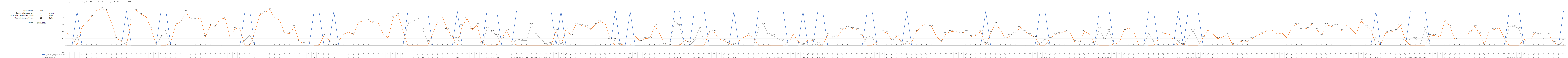
| Category | 1 = Strom reicht im Tagesdurchschnitt aus | Zusätzlich benötigter Strom | Überschüssiger Strom |
|---|---|---|---|
| 0 | 0 | 0.36 | 0 |
| 1 | 0 | 0.23 | 0 |
| 2 | 1 | 0 | 0.25 |
| 3 | 0 | 0.54 | 0 |
| 4 | 0 | 0.66 | 0 |
| 5 | 0 | 0.85 | 0 |
| 6 | 0 | 1.02 | 0 |
| 7 | 0 | 1.07 | 0 |
| 8 | 0 | 1.01 | 0 |
| 9 | 0 | 0.65 | 0 |
| 10 | 0 | 0.21 | 0 |
| 11 | 0 | 0.12 | 0 |
| 12 | 1 | 0 | 0.09 |
| 13 | 0 | 0.73 | 0 |
| 14 | 0 | 1.02 | 0 |
| 15 | 0 | 0.9 | 0 |
| 16 | 0 | 0.83 | 0 |
| 17 | 0 | 0.49 | 0 |
| 18 | 0 | 0.02 | 0 |
| 19 | 1 | 0 | 0.25 |
| 20 | 1 | 0 | 0.4 |
| 21 | 0 | 0.1 | 0 |
| 22 | 0 | 0.61 | 0 |
| 23 | 0 | 0.69 | 0 |
| 24 | 0 | 0.98 | 0 |
| 25 | 0 | 0.76 | 0 |
| 26 | 0 | 0.76 | 0 |
| 27 | 0 | 0.8 | 0 |
| 28 | 0 | 0.25 | 0 |
| 29 | 0 | 0.58 | 0 |
| 30 | 0 | 0.55 | 0 |
| 31 | 0 | 0.77 | 0 |
| 32 | 0 | 0.79 | 0 |
| 33 | 0 | 0.23 | 0 |
| 34 | 0 | 0.5 | 0 |
| 35 | 0 | 0.47 | 0 |
| 36 | 1 | 0 | 0.16 |
| 37 | 1 | 0 | 0.3 |
| 38 | 0 | 0.39 | 0 |
| 39 | 0 | 0.89 | 0 |
| 40 | 0 | 0.95 | 0 |
| 41 | 0 | 1.05 | 0 |
| 42 | 0 | 0.8 | 0 |
| 43 | 0 | 0.74 | 0 |
| 44 | 0 | 0.37 | 0 |
| 45 | 0 | 0.34 | 0 |
| 46 | 0 | 0.54 | 0 |
| 47 | 0 | 0.11 | 0 |
| 48 | 0 | 0.06 | 0 |
| 49 | 0 | 0.13 | 0 |
| 50 | 1 | 0 | 0.14 |
| 51 | 1 | 0 | 0.01 |
| 52 | 0 | 0.29 | 0 |
| 53 | 0 | 0.16 | 0 |
| 54 | 1 | 0 | 0 |
| 55 | 0 | 0.14 | 0 |
| 56 | 0 | 0.32 | 0 |
| 57 | 0 | 0.39 | 0 |
| 58 | 0 | 0.32 | 0 |
| 59 | 0 | 0.68 | 0 |
| 60 | 0 | 0.71 | 0 |
| 61 | 0 | 0.72 | 0 |
| 62 | 0 | 0.66 | 0 |
| 63 | 0 | 0.65 | 0 |
| 64 | 0 | 0.33 | 0 |
| 65 | 0 | 0.22 | 0 |
| 66 | 0 | 0.8 | 0 |
| 67 | 0 | 0.9 | 0 |
| 68 | 0 | 0.43 | 0 |
| 69 | 1 | 0 | 0.63 |
| 70 | 1 | 0 | 0.71 |
| 71 | 1 | 0 | 0.75 |
| 72 | 1 | 0 | 0.46 |
| 73 | 1 | 0 | 0.11 |
| 74 | 0 | 0.335 | 0 |
| 75 | 0 | 0.683 | 0 |
| 76 | 0 | 0.822 | 0 |
| 77 | 0 | 0.459 | 0 |
| 78 | 0 | 0.265 | 0 |
| 79 | 1 | 0 | 0.195 |
| 80 | 0 | 0.568 | 0 |
| 81 | 0 | 0.78 | 0 |
| 82 | 0 | 0.454 | 0 |
| 83 | 0 | 0.6 | 0 |
| 84 | 0 | 0.055 | 0 |
| 85 | 1 | 0 | 0.484 |
| 86 | 1 | 0 | 0.402 |
| 87 | 1 | 0 | 0.297 |
| 88 | 0 | 0.206 | 0 |
| 89 | 0 | 0.437 | 0 |
| 90 | 0 | 0.115 | 0 |
| 91 | 1 | 0 | 0.189 |
| 92 | 1 | 0 | 0.142 |
| 93 | 1 | 0 | 0.144 |
| 94 | 1 | 0 | 0.606 |
| 95 | 1 | 0 | 0.315 |
| 96 | 1 | 0 | 0.189 |
| 97 | 1 | 0 | 0.021 |
| 98 | 1 | 0 | 0.059 |
| 99 | 0 | 0.428 | 0 |
| 100 | 1 | 0 | 0.063 |
| 101 | 0 | 0.473 | 0 |
| 102 | 0 | 0.298 | 0 |
| 103 | 0 | 0.597 | 0 |
| 104 | 0 | 0.587 | 0 |
| 105 | 0 | 0.546 | 0 |
| 106 | 0 | 0.465 | 0 |
| 107 | 0 | 0.616 | 0 |
| 108 | 0 | 0.701 | 0 |
| 109 | 0 | 0.61 | 0 |
| 110 | 0 | 0.166 | 0 |
| 111 | 1 | 0 | 0.17 |
| 112 | 0 | 0.034 | 0 |
| 113 | 0 | 0.014 | 0 |
| 114 | 1 | 0 | 0.016 |
| 115 | 0 | 0.277 | 0 |
| 116 | 0 | 0.123 | 0 |
| 117 | 0 | 0.2 | 0 |
| 118 | 0 | 0.21 | 0 |
| 119 | 0 | 0.573 | 0 |
| 120 | 0 | 0.335 | 0 |
| 121 | 0 | 0.028 | 0 |
| 122 | 0 | 0.003 | 0 |
| 123 | 1 | 0 | 0.71 |
| 124 | 1 | 0 | 0.582 |
| 125 | 0 | 0.155 | 0 |
| 126 | 0 | 0.092 | 0 |
| 127 | 1 | 0 | 0.142 |
| 128 | 1 | 0 | 0.5 |
| 129 | 1 | 0 | 0.131 |
| 130 | 0 | 0.379 | 0 |
| 131 | 0 | 0.395 | 0 |
| 132 | 0 | 0.188 | 0 |
| 133 | 0 | 0.143 | 0 |
| 134 | 0 | 0.064 | 0 |
| 135 | 1 | 0 | 0.021 |
| 136 | 0 | 0.129 | 0 |
| 137 | 0 | 0.236 | 0 |
| 138 | 0 | 0.309 | 0 |
| 139 | 0 | 0.217 | 0 |
| 140 | 1 | 0 | 0.482 |
| 141 | 1 | 0 | 0.617 |
| 142 | 1 | 0 | 0.307 |
| 143 | 1 | 0 | 0.283 |
| 144 | 1 | 0 | 0.189 |
| 145 | 1 | 0 | 0.138 |
| 146 | 0 | 0.052 | 0 |
| 147 | 0 | 0.329 | 0 |
| 148 | 0 | 0.128 | 0 |
| 149 | 1 | 0 | 0.035 |
| 150 | 0 | 0.156 | 0 |
| 151 | 0 | 0.146 | 0 |
| 152 | 1 | 0 | 0.05 |
| 153 | 1 | 0 | 0.014 |
| 154 | 0 | 0.307 | 0 |
| 155 | 0 | 0.234 | 0 |
| 156 | 0 | 0.255 | 0 |
| 157 | 0 | 0.469 | 0 |
| 158 | 0 | 0.512 | 0 |
| 159 | 0 | 0.495 | 0 |
| 160 | 0 | 0.461 | 0 |
| 161 | 0 | 0.3 | 0 |
| 162 | 1 | 0 | 0.274 |
| 163 | 1 | 0 | 0.243 |
| 164 | 0 | 0.101 | 0 |
| 165 | 0 | 0.393 | 0 |
| 166 | 0 | 0.369 | 0 |
| 167 | 0 | 0.144 | 0 |
| 168 | 0 | 0.27 | 0 |
| 169 | 0 | 0.095 | 0 |
| 170 | 1 | 0 | 0.077 |
| 171 | 0 | 0.095 | 0 |
| 172 | 0 | 0.406 | 0 |
| 173 | 0 | 0.563 | 0 |
| 174 | 0 | 0.63 | 0 |
| 175 | 0 | 0.556 | 0 |
| 176 | 0 | 0.273 | 0 |
| 177 | 0 | 0.11 | 0 |
| 178 | 0 | 0.355 | 0 |
| 179 | 0 | 0.403 | 0 |
| 180 | 0 | 0.415 | 0 |
| 181 | 0 | 0.351 | 0 |
| 182 | 0 | 0.399 | 0 |
| 183 | 0 | 0.258 | 0 |
| 184 | 0 | 0.293 | 0 |
| 185 | 0 | 0.408 | 0 |
| 186 | 1 | 0 | 0.065 |
| 187 | 0 | 0.367 | 0 |
| 188 | 0 | 0.629 | 0 |
| 189 | 0 | 0.448 | 0 |
| 190 | 0 | 0.191 | 0 |
| 191 | 0 | 0.281 | 0 |
| 192 | 0 | 0.35 | 0 |
| 193 | 0 | 0.528 | 0 |
| 194 | 0 | 0.402 | 0 |
| 195 | 0 | 0.31 | 0 |
| 196 | 0 | 0.235 | 0 |
| 197 | 1 | 0 | 0.063 |
| 198 | 1 | 0 | 0.187 |
| 199 | 0 | 0.206 | 0 |
| 200 | 0 | 0.309 | 0 |
| 201 | 0 | 0.354 | 0 |
| 202 | 0 | 0.404 | 0 |
| 203 | 0 | 0.388 | 0 |
| 204 | 0 | 0.11 | 0 |
| 205 | 0 | 0.093 | 0 |
| 206 | 0 | 0.41 | 0 |
| 207 | 0 | 0.329 | 0 |
| 208 | 0 | 0.066 | 0 |
| 209 | 1 | 0 | 0.493 |
| 210 | 1 | 0 | 0.182 |
| 211 | 1 | 0 | 0.433 |
| 212 | 0 | 0.042 | 0 |
| 213 | 0 | 0.071 | 0 |
| 214 | 0 | 0.441 | 0 |
| 215 | 0 | 0.51 | 0 |
| 216 | 0 | 0.389 | 0 |
| 217 | 0 | 0.012 | 0 |
| 218 | 0 | 0.011 | 0 |
| 219 | 1 | 0 | 0.358 |
| 220 | 1 | 0 | 0.112 |
| 221 | 0 | 0.184 | 0 |
| 222 | 0 | 0.34 | 0 |
| 223 | 0 | 0.36 | 0 |
| 224 | 0 | 0.168 | 0 |
| 225 | 1 | 0 | 0.116 |
| 226 | 0 | 0.036 | 0 |
| 227 | 1 | 0 | 0.242 |
| 228 | 1 | 0 | 0.43 |
| 229 | 1 | 0 | 0.129 |
| 230 | 0 | 0.223 | 0 |
| 231 | 0 | 0.451 | 0 |
| 232 | 0 | 0.331 | 0 |
| 233 | 0 | 0.194 | 0 |
| 234 | 0 | 0.249 | 0 |
| 235 | 0 | 0.314 | 0 |
| 236 | 0 | 0.019 | 0 |
| 237 | 0 | 0.095 | 0 |
| 238 | 0 | 0.122 | 0 |
| 239 | 0 | 0.118 | 0 |
| 240 | 0 | 0.198 | 0 |
| 241 | 0 | 0.302 | 0 |
| 242 | 0 | 0.341 | 0 |
| 243 | 0 | 0.444 | 0 |
| 244 | 0 | 0.445 | 0 |
| 245 | 0 | 0.329 | 0 |
| 246 | 0 | 0.361 | 0 |
| 247 | 0 | 0.216 | 0 |
| 248 | 0 | 0.534 | 0 |
| 249 | 0 | 0.615 | 0 |
| 250 | 0 | 0.472 | 0 |
| 251 | 0 | 0.495 | 0 |
| 252 | 0 | 0.613 | 0 |
| 253 | 0 | 0.47 | 0 |
| 254 | 0 | 0.296 | 0 |
| 255 | 0 | 0.6 | 0 |
| 256 | 0 | 0.55 | 0 |
| 257 | 0 | 0.576 | 0 |
| 258 | 0 | 0.432 | 0 |
| 259 | 0 | 0.59 | 0 |
| 260 | 0 | 0.477 | 0 |
| 261 | 0 | 0.331 | 0 |
| 262 | 0 | 0.714 | 0 |
| 263 | 0 | 0.548 | 0 |
| 264 | 0 | 0.476 | 0 |
| 265 | 1 | 0 | 0.242 |
| 266 | 0 | 0.041 | 0 |
| 267 | 0 | 0.369 | 0 |
| 268 | 0 | 0.396 | 0 |
| 269 | 0 | 0.43 | 0 |
| 270 | 0 | 0.579 | 0 |
| 271 | 0 | 0.143 | 0 |
| 272 | 1 | 0 | 0.215 |
| 273 | 1 | 0 | 0.205 |
| 274 | 1 | 0 | 0.042 |
| 275 | 1 | 0 | 0.487 |
| 276 | 0 | 0.297 | 0 |
| 277 | 0 | 0.287 | 0 |
| 278 | 0 | 0.249 | 0 |
| 279 | 0 | 0.736 | 0 |
| 280 | 0 | 0.554 | 0 |
| 281 | 0 | 0.174 | 0 |
| 282 | 0 | 0.313 | 0 |
| 283 | 0 | 0.303 | 0 |
| 284 | 0 | 0.365 | 0 |
| 285 | 0 | 0.552 | 0 |
| 286 | 0 | 0.346 | 0 |
| 287 | 0 | 0.022 | 0 |
| 288 | 0 | 0.449 | 0 |
| 289 | 0 | 0.462 | 0 |
| 290 | 0 | 0.506 | 0 |
| 291 | 0 | 0.219 | 0 |
| 292 | 1 | 0 | 0.525 |
| 293 | 1 | 0 | 0.56 |
| 294 | 1 | 0 | 0.482 |
| 295 | 0 | 0.183 | 0 |
| 296 | 0 | 0.07 | 0 |
| 297 | 0 | 0.347 | 0 |
| 298 | 0 | 0.322 | 0 |
| 299 | 0 | 0.176 | 0 |
| 300 | 0 | 0.307 | 0 |
| 301 | 0 | 0.088 | 0 |
| 302 | 0 | 0.004 | 0 |
| 303 | 1 | 0 | 0.154 |